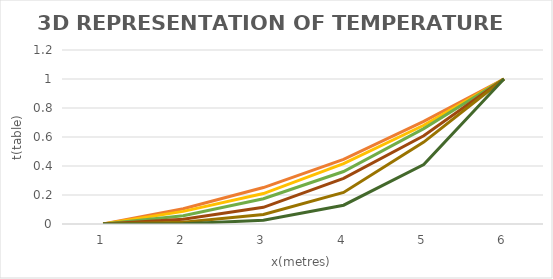
| Category | Series 0 | Series 1 | Series 2 | Series 3 | Series 4 | Series 5 |
|---|---|---|---|---|---|---|
| 0 | 0 | 0 | 0 | 0 | 0 | 0 |
| 1 | 0.105 | 0.087 | 0.058 | 0.033 | 0.013 | 0.002 |
| 2 | 0.251 | 0.21 | 0.174 | 0.115 | 0.066 | 0.026 |
| 3 | 0.445 | 0.416 | 0.362 | 0.315 | 0.218 | 0.13 |
| 4 | 0.708 | 0.681 | 0.658 | 0.609 | 0.565 | 0.41 |
| 5 | 1 | 1 | 1 | 1 | 1 | 1 |